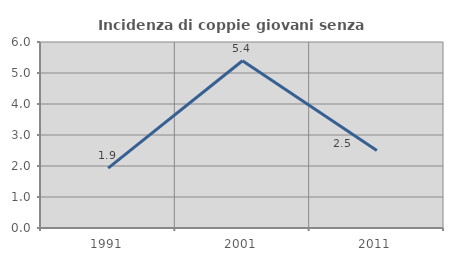
| Category | Incidenza di coppie giovani senza figli |
|---|---|
| 1991.0 | 1.931 |
| 2001.0 | 5.394 |
| 2011.0 | 2.5 |